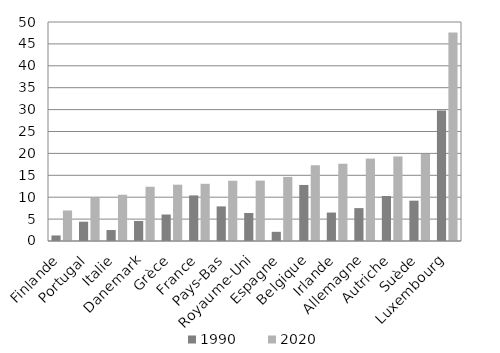
| Category | 1990 | 2020 |
|---|---|---|
| Finlande | 1.266 | 6.968 |
| Portugal | 4.404 | 9.826 |
| Italie | 2.504 | 10.564 |
| Danemark | 4.575 | 12.389 |
| Grèce | 6.045 | 12.86 |
| France | 10.407 | 13.06 |
| Pays-Bas | 7.9 | 13.763 |
| Royaume-Uni | 6.389 | 13.787 |
| Espagne | 2.096 | 14.634 |
| Belgique | 12.797 | 17.304 |
| Irlande | 6.493 | 17.645 |
| Allemagne | 7.509 | 18.813 |
| Autriche | 10.27 | 19.299 |
| Suède | 9.207 | 19.842 |
| Luxembourg | 29.806 | 47.616 |